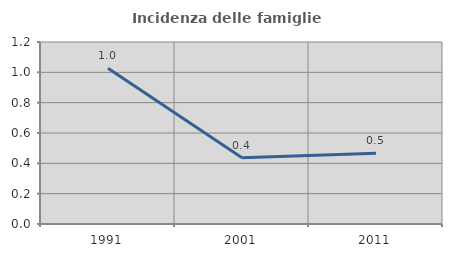
| Category | Incidenza delle famiglie numerose |
|---|---|
| 1991.0 | 1.027 |
| 2001.0 | 0.437 |
| 2011.0 | 0.466 |